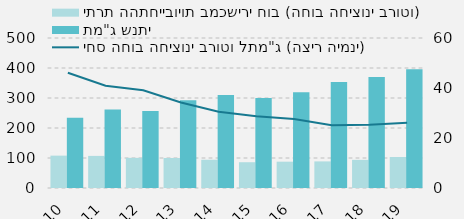
| Category | יתרת ההתחייבויות במכשירי חוב (החוב החיצוני ברוטו) | תמ"ג שנתי  |
|---|---|---|
| 2010.0 | 107878.34 | 234368.713 |
| 2011.0 | 106981.494 | 261630.116 |
| 2012.0 | 100468.09 | 257026.318 |
| 2013.0 | 99987.783 | 292792.303 |
| 2014.0 | 94176.047 | 309913.457 |
| 2015.0 | 85917.134 | 300065.029 |
| 2016.0 | 87733.449 | 318997.442 |
| 2017.0 | 88640.748 | 353664.921 |
| 2018.0 | 93797 | 370015.02 |
| 2019.0 | 103427 | 395530.165 |